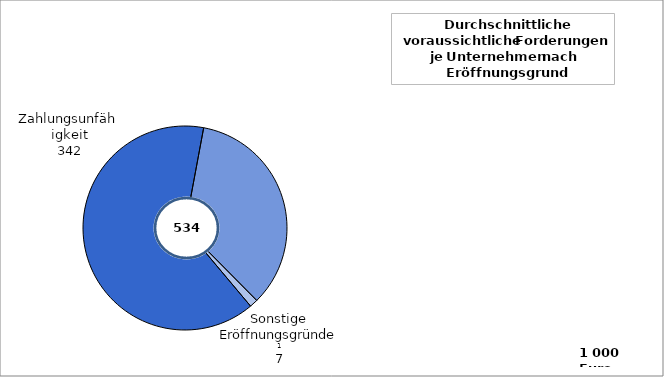
| Category | Series 0 | Series 1 |
|---|---|---|
| Zahlungsunfähigkeit | 342 | 303 |
|   Zahlungsunfähigkeit
   und Überschuldung | 185 | 2464 |
|   Sonstige Eröffnungs-
                      gründe  2 | 7 | 562 |